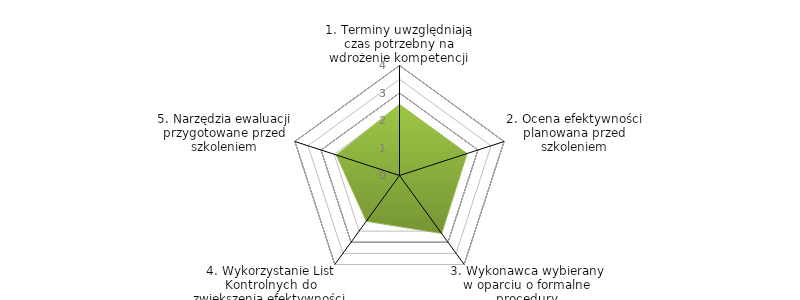
| Category | Series 0 | BENCHMARK |
|---|---|---|
| 1. Terminy uwzględniają czas potrzebny na wdrożenie kompetencji |  | 2.583 |
| 2. Ocena efektywności planowana przed szkoleniem |  | 2.583 |
| 3. Wykonawca wybierany w oparciu o formalne procedury |  | 2.611 |
| 4. Wykorzystanie List Kontrolnych do zwiększenia efektywności |  | 2.056 |
| 5. Narzędzia ewaluacji przygotowane przed szkoleniem |  | 2.417 |